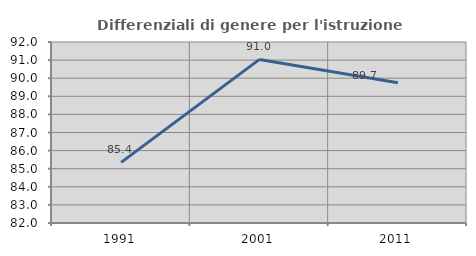
| Category | Differenziali di genere per l'istruzione superiore |
|---|---|
| 1991.0 | 85.35 |
| 2001.0 | 91.038 |
| 2011.0 | 89.747 |